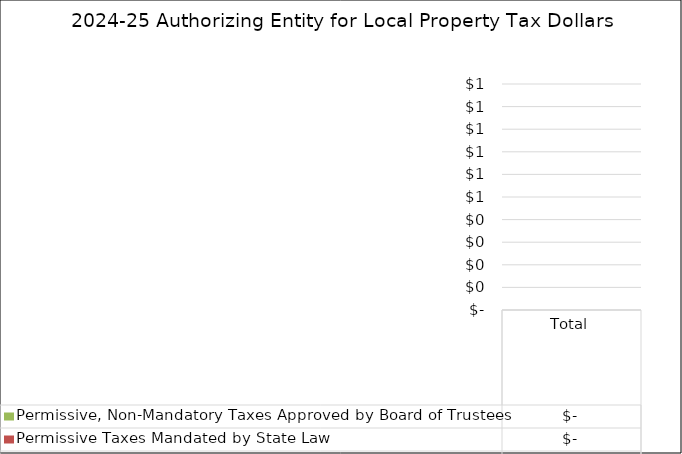
| Category | Voter Approved Taxes | Permissive Taxes Mandated by State Law | Permissive, Non-Mandatory Taxes Approved by Board of Trustees |
|---|---|---|---|
| Total | 0 | 0 | 0 |